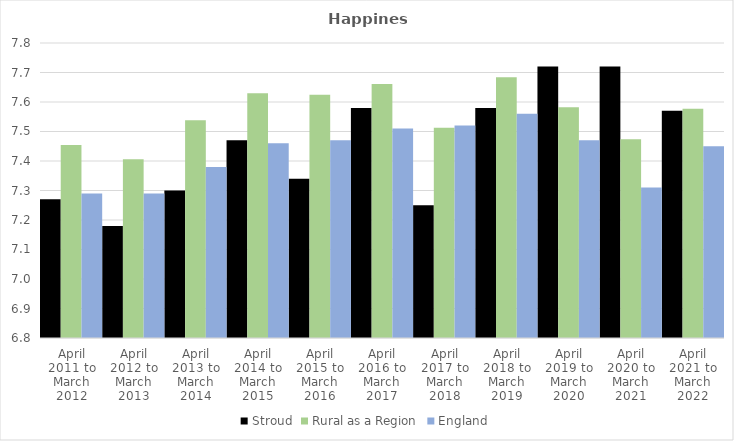
| Category | Stroud | Rural as a Region | England |
|---|---|---|---|
| April 2011 to March 2012 | 7.27 | 7.454 | 7.29 |
| April 2012 to March 2013 | 7.18 | 7.406 | 7.29 |
| April 2013 to March 2014 | 7.3 | 7.539 | 7.38 |
| April 2014 to March 2015 | 7.47 | 7.63 | 7.46 |
| April 2015 to March 2016 | 7.34 | 7.625 | 7.47 |
| April 2016 to March 2017 | 7.58 | 7.661 | 7.51 |
| April 2017 to March 2018 | 7.25 | 7.513 | 7.52 |
| April 2018 to March 2019 | 7.58 | 7.684 | 7.56 |
| April 2019 to March 2020 | 7.72 | 7.582 | 7.47 |
| April 2020 to March 2021 | 7.72 | 7.474 | 7.31 |
| April 2021 to March 2022 | 7.57 | 7.577 | 7.45 |